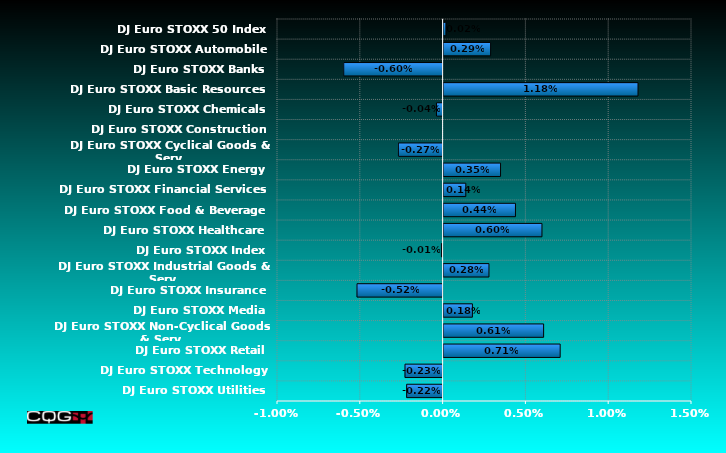
| Category | Series 0 |
|---|---|
| DJ Euro STOXX Utilities | -0.002 |
| DJ Euro STOXX Technology | -0.002 |
| DJ Euro STOXX Retail | 0.007 |
| DJ Euro STOXX Non-Cyclical Goods & Serv | 0.006 |
| DJ Euro STOXX Media | 0.002 |
| DJ Euro STOXX Insurance | -0.005 |
| DJ Euro STOXX Industrial Goods & Serv | 0.003 |
| DJ Euro STOXX Index | 0 |
| DJ Euro STOXX Healthcare | 0.006 |
| DJ Euro STOXX Food & Beverage | 0.004 |
| DJ Euro STOXX Financial Services | 0.001 |
| DJ Euro STOXX Energy | 0.003 |
| DJ Euro STOXX Cyclical Goods & Serv | -0.003 |
| DJ Euro STOXX Construction | 0 |
| DJ Euro STOXX Chemicals | 0 |
| DJ Euro STOXX Basic Resources | 0.012 |
| DJ Euro STOXX Banks | -0.006 |
| DJ Euro STOXX Automobile | 0.003 |
| DJ Euro STOXX 50 Index | 0 |